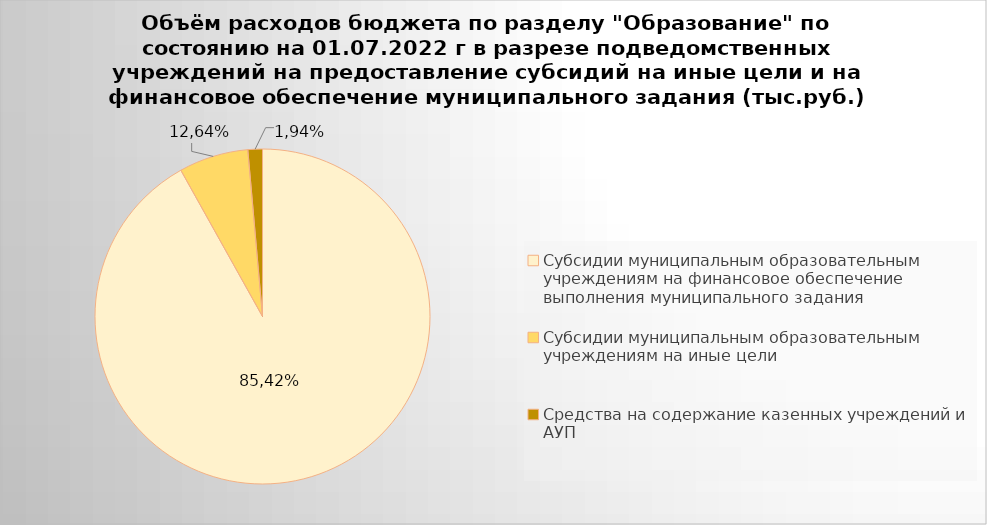
| Category | Series 0 |
|---|---|
| Субсидии муниципальным образовательным учреждениям на финансовое обеспечение выполнения муниципального задания | 7035793.97 |
| Субсидии муниципальным образовательным учреждениям на иные цели | 513343.7 |
| Средства на содержание казенных учреждений и АУП | 107165.44 |